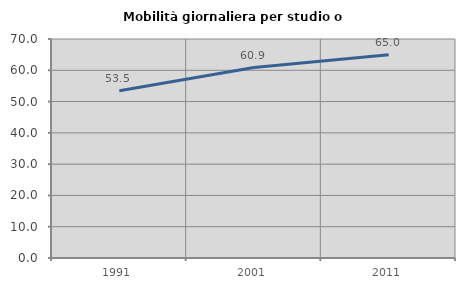
| Category | Mobilità giornaliera per studio o lavoro |
|---|---|
| 1991.0 | 53.468 |
| 2001.0 | 60.883 |
| 2011.0 | 64.95 |